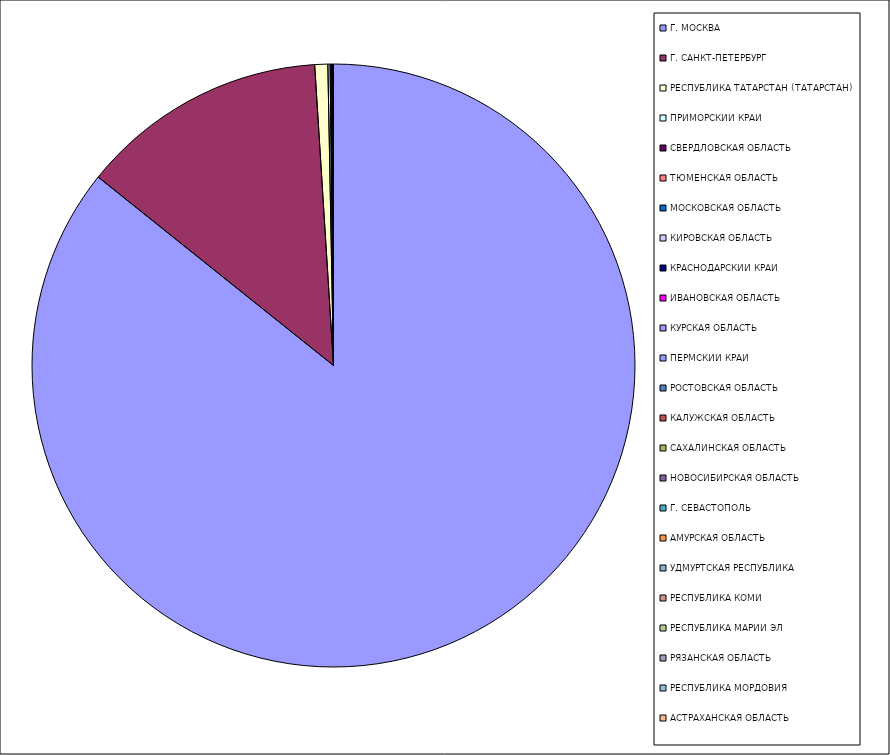
| Category | Оборот |
|---|---|
| Г. МОСКВА | 85.743 |
| Г. САНКТ-ПЕТЕРБУРГ | 13.258 |
| РЕСПУБЛИКА ТАТАРСТАН (ТАТАРСТАН) | 0.696 |
| ПРИМОРСКИЙ КРАЙ | 0.118 |
| СВЕРДЛОВСКАЯ ОБЛАСТЬ | 0.087 |
| ТЮМЕНСКАЯ ОБЛАСТЬ | 0.017 |
| МОСКОВСКАЯ ОБЛАСТЬ | 0.016 |
| КИРОВСКАЯ ОБЛАСТЬ | 0.01 |
| КРАСНОДАРСКИЙ КРАЙ | 0.009 |
| ИВАНОВСКАЯ ОБЛАСТЬ | 0.007 |
| КУРСКАЯ ОБЛАСТЬ | 0.005 |
| ПЕРМСКИЙ КРАЙ | 0.004 |
| РОСТОВСКАЯ ОБЛАСТЬ | 0.004 |
| КАЛУЖСКАЯ ОБЛАСТЬ | 0.004 |
| САХАЛИНСКАЯ ОБЛАСТЬ | 0.004 |
| НОВОСИБИРСКАЯ ОБЛАСТЬ | 0.004 |
| Г. СЕВАСТОПОЛЬ | 0.002 |
| АМУРСКАЯ ОБЛАСТЬ | 0.002 |
| УДМУРТСКАЯ РЕСПУБЛИКА | 0.002 |
| РЕСПУБЛИКА КОМИ | 0.002 |
| РЕСПУБЛИКА МАРИЙ ЭЛ | 0.001 |
| РЯЗАНСКАЯ ОБЛАСТЬ | 0.001 |
| РЕСПУБЛИКА МОРДОВИЯ | 0.001 |
| АСТРАХАНСКАЯ ОБЛАСТЬ | 0.001 |